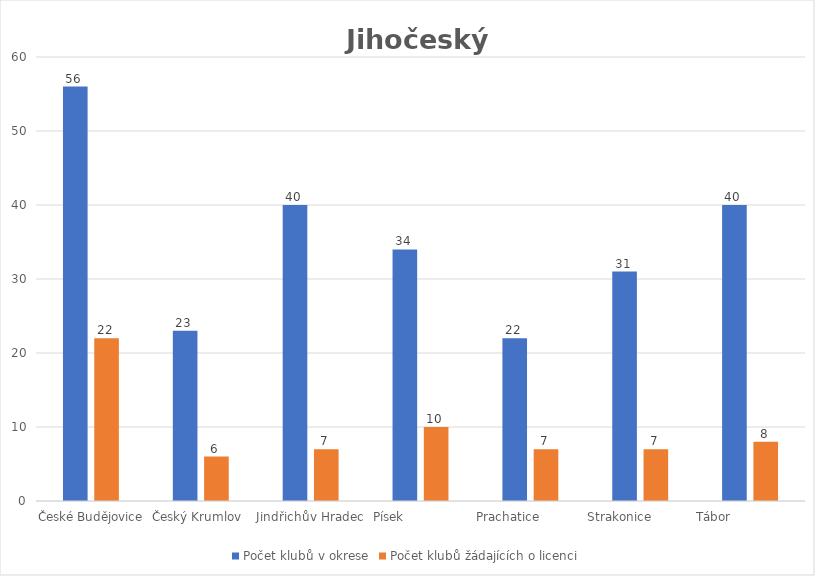
| Category | Počet klubů v okrese | Počet klubů žádajících o licenci |
|---|---|---|
| České Budějovice | 56 | 22 |
| Český Krumlov  | 23 | 6 |
| Jindřichův Hradec | 40 | 7 |
| Písek                 | 34 | 10 |
| Prachatice             | 22 | 7 |
| Strakonice           | 31 | 7 |
| Tábor                    | 40 | 8 |